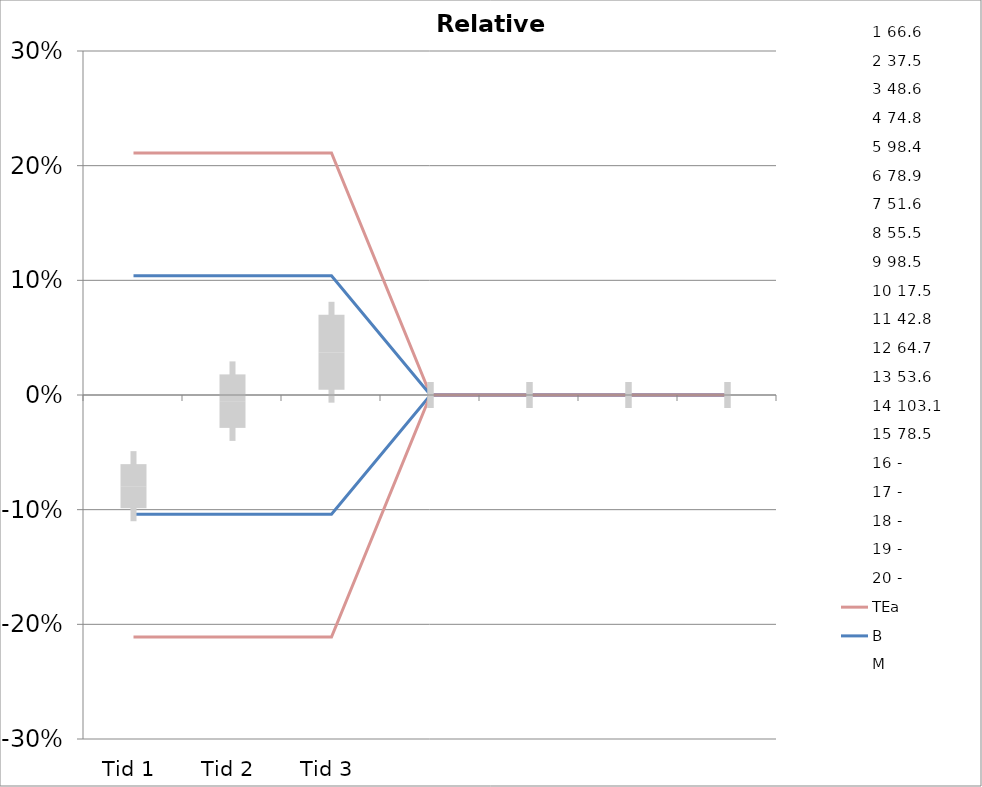
| Category | 1 | 2 | 3 | 4 | 5 | 6 | 7 | 8 | 9 | 10 | 11 | 12 | 13 | 14 | 15 | 16 | 17 | 18 | 19 | 20 | TEa | B | -B | -TEa | M |
|---|---|---|---|---|---|---|---|---|---|---|---|---|---|---|---|---|---|---|---|---|---|---|---|---|---|
| Tid 1 | -0.057 | -0.061 | -0.13 | -0.083 | -0.067 | -0.032 | -0.095 | -0.02 | -0.13 | -0.126 | -0.096 | -0.071 | -0.078 | -0.107 | -0.041 | 0 | 0 | 0 | 0 | 0 | 0.211 | 0.104 | -0.104 | -0.211 | -0.08 |
| Tid 2 | 0.003 | 0.016 | -0.068 | 0.02 | 0.032 | 0.049 | 0.037 | 0.007 | 0.037 | 0.006 | -0.009 | -0.036 | -0.049 | -0.096 | -0.029 | 0 | 0 | 0 | 0 | 0 | 0.211 | 0.104 | -0.104 | -0.211 | -0.005 |
| Tid 3 | 0.027 | 0.125 | -0.025 | -0.011 | 0.07 | 0.133 | 0.066 | 0.085 | 0.111 | 0.017 | -0.042 | -0.009 | -0.013 | -0.028 | 0.054 | 0 | 0 | 0 | 0 | 0 | 0.211 | 0.104 | -0.104 | -0.211 | 0.037 |